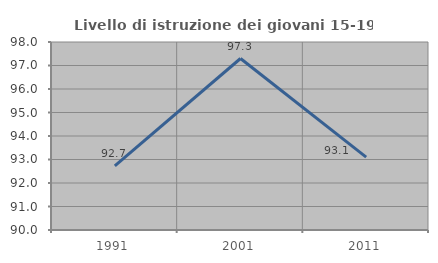
| Category | Livello di istruzione dei giovani 15-19 anni |
|---|---|
| 1991.0 | 92.727 |
| 2001.0 | 97.297 |
| 2011.0 | 93.103 |